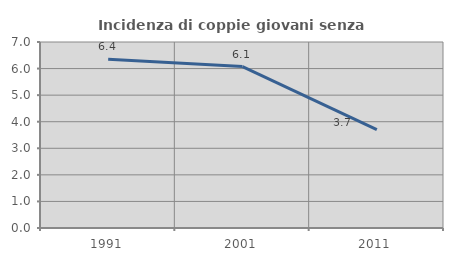
| Category | Incidenza di coppie giovani senza figli |
|---|---|
| 1991.0 | 6.353 |
| 2001.0 | 6.076 |
| 2011.0 | 3.701 |